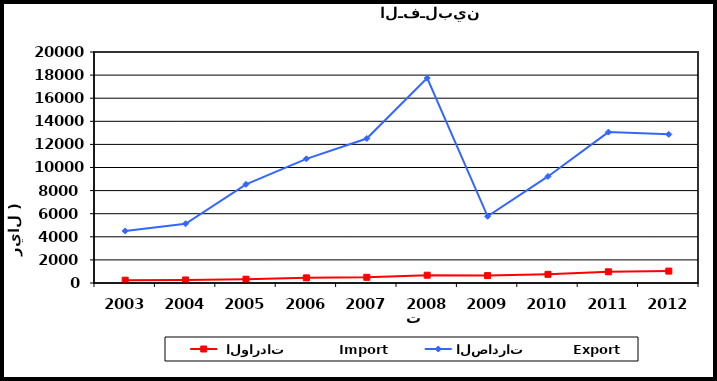
| Category |  الواردات           Import | الصادرات          Export |
|---|---|---|
| 2003.0 | 245 | 4505 |
| 2004.0 | 263 | 5130 |
| 2005.0 | 331 | 8544 |
| 2006.0 | 447 | 10751 |
| 2007.0 | 493 | 12510 |
| 2008.0 | 676 | 17742 |
| 2009.0 | 640 | 5773 |
| 2010.0 | 750 | 9226 |
| 2011.0 | 972 | 13064 |
| 2012.0 | 1030 | 12870 |